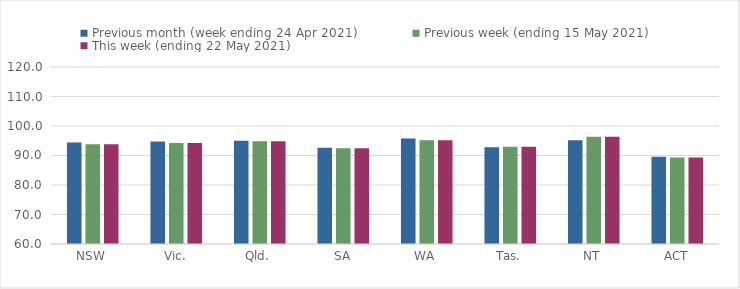
| Category | Previous month (week ending 24 Apr 2021) | Previous week (ending 15 May 2021) | This week (ending 22 May 2021) |
|---|---|---|---|
| NSW | 94.43 | 93.84 | 93.84 |
| Vic. | 94.71 | 94.2 | 94.2 |
| Qld. | 95.01 | 94.8 | 94.8 |
| SA | 92.63 | 92.43 | 92.43 |
| WA | 95.74 | 95.17 | 95.17 |
| Tas. | 92.82 | 92.93 | 92.93 |
| NT | 95.13 | 96.35 | 96.35 |
| ACT | 89.59 | 89.31 | 89.31 |